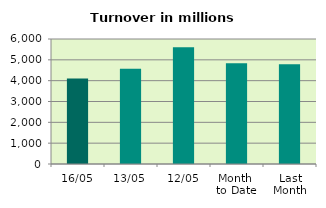
| Category | Series 0 |
|---|---|
| 16/05 | 4106.933 |
| 13/05 | 4573.193 |
| 12/05 | 5600.742 |
| Month 
to Date | 4838.303 |
| Last
Month | 4785.141 |